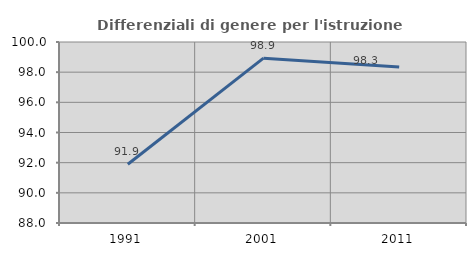
| Category | Differenziali di genere per l'istruzione superiore |
|---|---|
| 1991.0 | 91.894 |
| 2001.0 | 98.929 |
| 2011.0 | 98.34 |